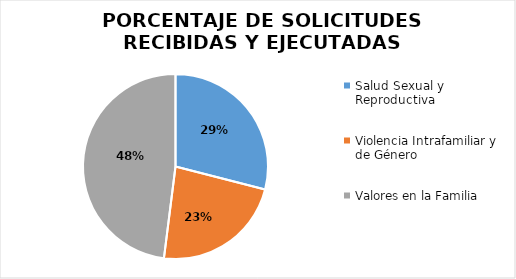
| Category | Series 0 |
|---|---|
| Salud Sexual y Reproductiva | 0.29 |
| Violencia Intrafamiliar y de Género | 0.23 |
| Valores en la Familia | 0.48 |